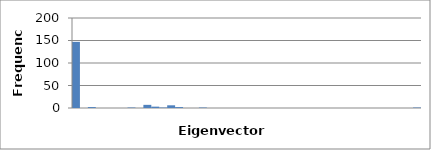
| Category | 147 |
|---|---|
| 0.0 | 147 |
| 0.003514953488372093 | 0 |
| 0.007029906976744186 | 2 |
| 0.010544860465116278 | 0 |
| 0.014059813953488372 | 0 |
| 0.017574767441860466 | 0 |
| 0.02108972093023256 | 0 |
| 0.024604674418604654 | 1 |
| 0.02811962790697675 | 0 |
| 0.03163458139534884 | 7 |
| 0.03514953488372093 | 3 |
| 0.03866448837209303 | 1 |
| 0.04217944186046512 | 6 |
| 0.045694395348837215 | 2 |
| 0.04920934883720931 | 0 |
| 0.0527243023255814 | 0 |
| 0.0562392558139535 | 1 |
| 0.05975420930232559 | 0 |
| 0.06326916279069768 | 0 |
| 0.06678411627906977 | 0 |
| 0.07029906976744187 | 0 |
| 0.07381402325581396 | 0 |
| 0.07732897674418605 | 0 |
| 0.08084393023255815 | 0 |
| 0.08435888372093024 | 0 |
| 0.08787383720930234 | 0 |
| 0.09138879069767443 | 0 |
| 0.09490374418604652 | 0 |
| 0.09841869767441862 | 0 |
| 0.10193365116279071 | 0 |
| 0.1054486046511628 | 0 |
| 0.1089635581395349 | 0 |
| 0.112478511627907 | 0 |
| 0.11599346511627909 | 0 |
| 0.11950841860465118 | 0 |
| 0.12302337209302328 | 0 |
| 0.12653832558139536 | 0 |
| 0.13005327906976744 | 0 |
| 0.13356823255813952 | 0 |
| 0.1370831860465116 | 0 |
| 0.14059813953488368 | 0 |
| 0.14411309302325576 | 0 |
| 0.14762804651162784 | 0 |
| 0.151143 | 1 |